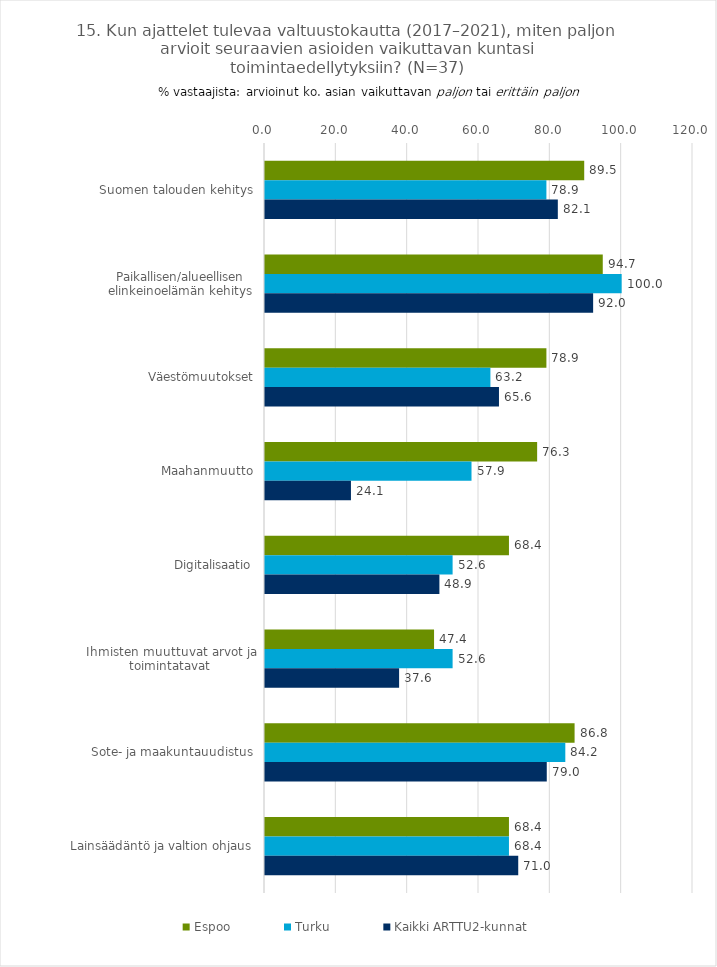
| Category | Espoo | Turku | Kaikki ARTTU2-kunnat |
|---|---|---|---|
| Suomen talouden kehitys | 89.5 | 78.9 | 82.1 |
| Paikallisen/alueellisen elinkeinoelämän kehitys | 94.7 | 100 | 92 |
| Väestömuutokset | 78.9 | 63.2 | 65.6 |
| Maahanmuutto | 76.3 | 57.9 | 24.1 |
| Digitalisaatio | 68.4 | 52.6 | 48.9 |
| Ihmisten muuttuvat arvot ja toimintatavat | 47.4 | 52.6 | 37.6 |
| Sote- ja maakuntauudistus | 86.8 | 84.2 | 79 |
| Lainsäädäntö ja valtion ohjaus | 68.4 | 68.4 | 71 |